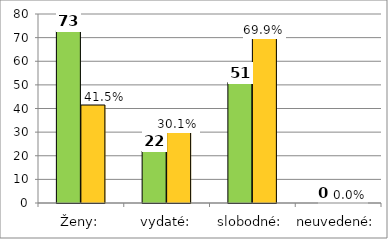
| Category | Series 0 | Series 1 |
|---|---|---|
| Ženy: | 73 | 41.477 |
| vydaté: | 22 | 30.137 |
| slobodné: | 51 | 69.863 |
| neuvedené: | 0 | 0 |